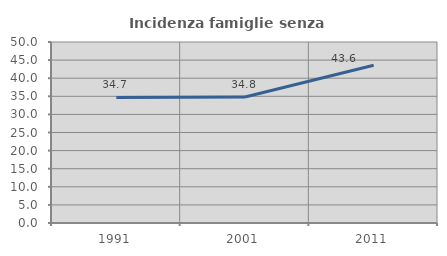
| Category | Incidenza famiglie senza nuclei |
|---|---|
| 1991.0 | 34.7 |
| 2001.0 | 34.812 |
| 2011.0 | 43.581 |